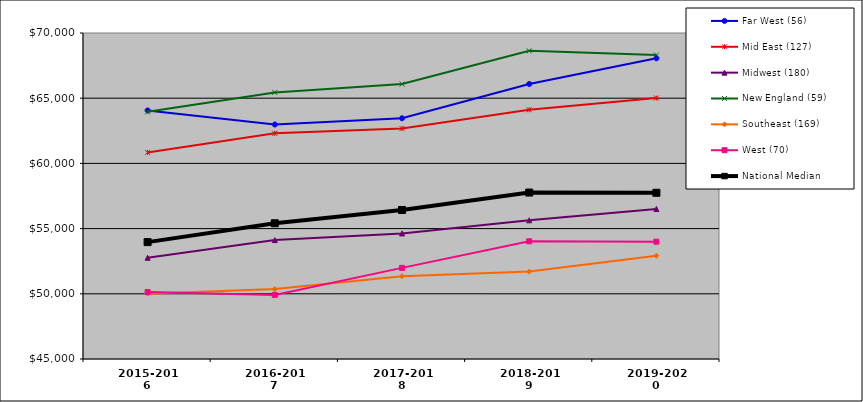
| Category | Far West (56) | Mid East (127) | Midwest (180) | New England (59) | Southeast (169) | West (70) | National Median |
|---|---|---|---|---|---|---|---|
| 2015-2016 | 64062 | 60840 | 52762.5 | 63954 | 50013 | 50139 | 53964 |
| 2016-2017 | 62982 | 62306 | 54118.5 | 65445 | 50363 | 49914 | 55410 |
| 2017-2018 | 63462 | 62674 | 54629.5 | 66084 | 51350 | 51986.5 | 56428 |
| 2018-2019 | 66089 | 64115 | 55637 | 68630 | 51707 | 54026.5 | 57764 |
| 2019-2020 | 68058 | 65011 | 56506 | 68309 | 52917 | 53995.5 | 57747 |